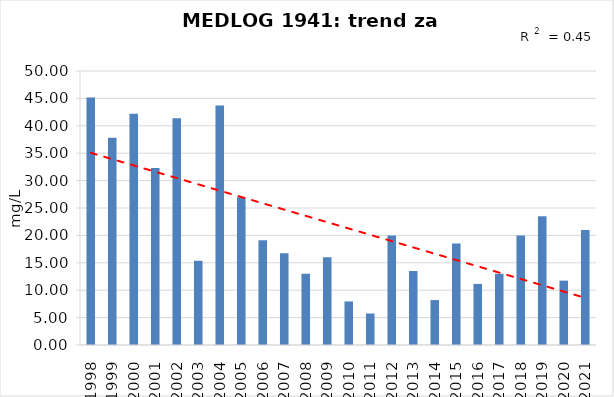
| Category | Vsota |
|---|---|
| 1998 | 45.15 |
| 1999 | 37.8 |
| 2000 | 42.2 |
| 2001 | 32.3 |
| 2002 | 41.4 |
| 2003 | 15.375 |
| 2004 | 43.7 |
| 2005 | 26.967 |
| 2006 | 19.1 |
| 2007 | 16.75 |
| 2008 | 13 |
| 2009 | 16 |
| 2010 | 7.95 |
| 2011 | 5.75 |
| 2012 | 20 |
| 2013 | 13.5 |
| 2014 | 8.2 |
| 2015 | 18.5 |
| 2016 | 11.15 |
| 2017 | 13 |
| 2018 | 20 |
| 2019 | 23.5 |
| 2020 | 11.75 |
| 2021 | 21 |